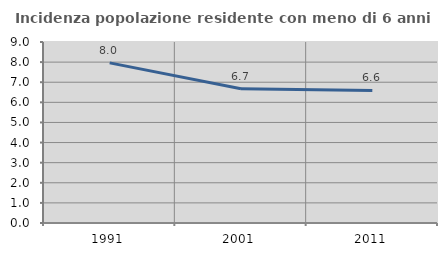
| Category | Incidenza popolazione residente con meno di 6 anni |
|---|---|
| 1991.0 | 7.961 |
| 2001.0 | 6.678 |
| 2011.0 | 6.591 |